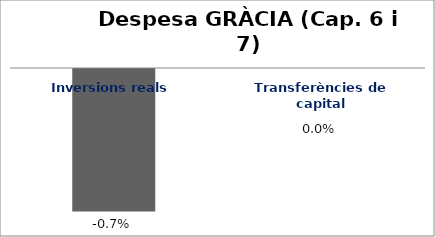
| Category | Series 0 |
|---|---|
| Inversions reals | -0.007 |
| Transferències de capital | 0 |